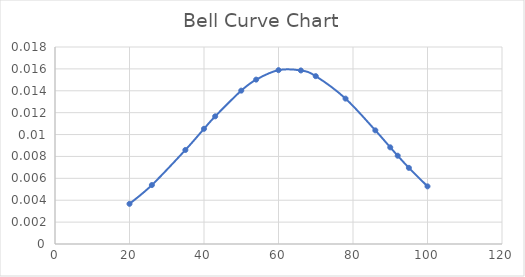
| Category | Distribution |
|---|---|
| 20.0 | 0.004 |
| 26.0 | 0.005 |
| 35.0 | 0.009 |
| 40.0 | 0.011 |
| 43.0 | 0.012 |
| 50.0 | 0.014 |
| 54.0 | 0.015 |
| 60.0 | 0.016 |
| 66.0 | 0.016 |
| 70.0 | 0.015 |
| 78.0 | 0.013 |
| 86.0 | 0.01 |
| 90.0 | 0.009 |
| 92.0 | 0.008 |
| 95.0 | 0.007 |
| 100.0 | 0.005 |